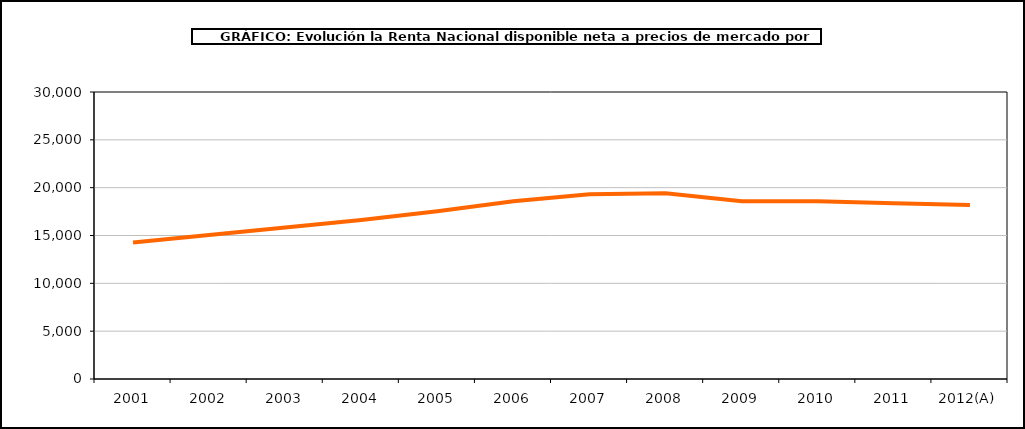
| Category | Renta por habitante |
|---|---|
| 2001 | 14269.745 |
| 2002 | 15052.549 |
| 2003 | 15836.742 |
| 2004 | 16621.881 |
| 2005 | 17541.649 |
| 2006 | 18572.78 |
| 2007 | 19320.224 |
| 2008 | 19421.473 |
| 2009 | 18581.118 |
| 2010 | 18573.787 |
| 2011 | 18369.156 |
| 2012(A) | 18194.792 |